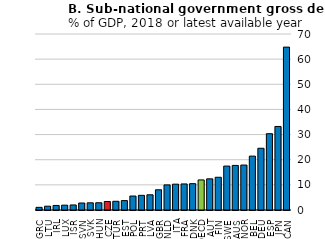
| Category | Sub-national government |
|---|---|
| GRC | 1.053 |
| LTU | 1.514 |
| IRL | 1.808 |
| LUX | 1.921 |
| ISR | 2.007 |
| SVN | 2.782 |
| SVK | 2.855 |
| HUN | 2.881 |
| CZE | 3.363 |
| TUR | 3.466 |
| EST | 3.735 |
| POL | 5.559 |
| PRT | 5.824 |
| LVA | 6.051 |
| GBR | 8.039 |
| NLD | 9.982 |
| ITA | 10.277 |
| FRA | 10.365 |
| DNK | 10.475 |
| OECD | 11.958 |
| AUT | 12.396 |
| FIN | 13.014 |
| SWE | 17.469 |
| AUS | 17.735 |
| NOR | 17.878 |
| BEL | 21.428 |
| DEU | 24.556 |
| ESP | 30.349 |
| JPN | 33.218 |
| CAN | 64.781 |